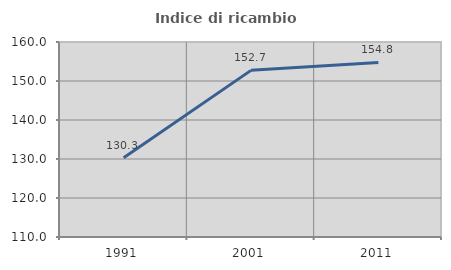
| Category | Indice di ricambio occupazionale  |
|---|---|
| 1991.0 | 130.337 |
| 2001.0 | 152.727 |
| 2011.0 | 154.762 |